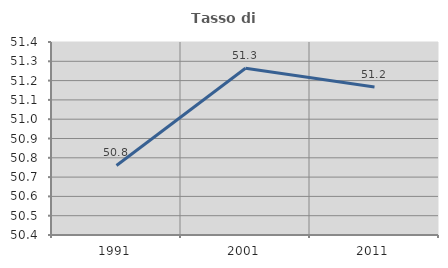
| Category | Tasso di occupazione   |
|---|---|
| 1991.0 | 50.76 |
| 2001.0 | 51.264 |
| 2011.0 | 51.167 |